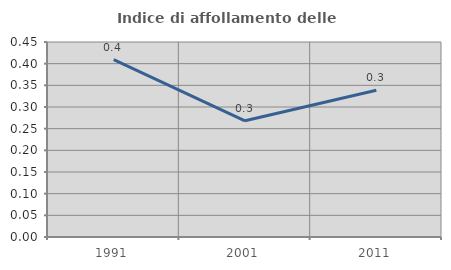
| Category | Indice di affollamento delle abitazioni  |
|---|---|
| 1991.0 | 0.409 |
| 2001.0 | 0.268 |
| 2011.0 | 0.339 |